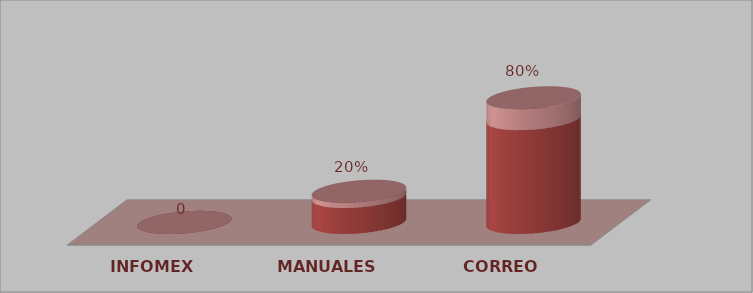
| Category | Series 0 | Series 1 |
|---|---|---|
| INFOMEX | 0 | 0 |
| MANUALES | 1 | 0.2 |
| CORREO | 4 | 0.8 |